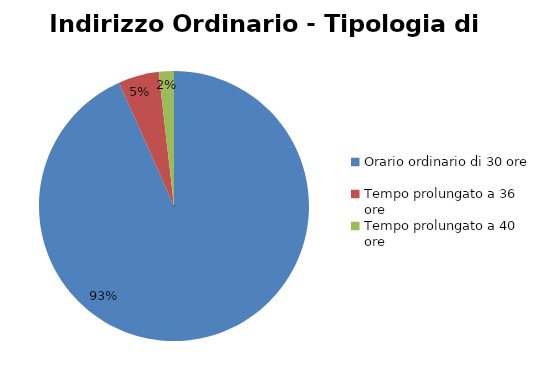
| Category | Series 0 |
|---|---|
| Orario ordinario di 30 ore | 34719 |
| Tempo prolungato a 36 ore | 1810 |
| Tempo prolungato a 40 ore | 673 |